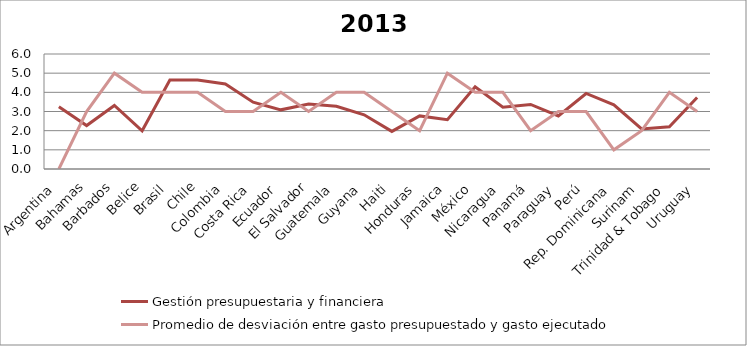
| Category | Gestión presupuestaria y financiera | Promedio de desviación entre gasto presupuestado y gasto ejecutado |
|---|---|---|
| Argentina | 3.253 | 0 |
| Bahamas | 2.267 | 3 |
| Barbados | 3.313 | 5 |
| Belice | 1.995 | 4 |
| Brasil | 4.64 | 4 |
| Chile | 4.64 | 4 |
| Colombia | 4.44 | 3 |
| Costa Rica | 3.485 | 3 |
| Ecuador | 3.087 | 4 |
| El Salvador | 3.392 | 3 |
| Guatemala | 3.275 | 4 |
| Guyana | 2.827 | 4 |
| Haiti | 1.961 | 3 |
| Honduras | 2.771 | 2 |
| Jamaica | 2.573 | 5 |
| México | 4.287 | 4 |
| Nicaragua | 3.22 | 4 |
| Panamá | 3.367 | 2 |
| Paraguay | 2.767 | 3 |
| Perú | 3.94 | 3 |
| Rep. Dominicana | 3.347 | 1 |
| Surinam | 2.093 | 2 |
| Trinidad & Tobago | 2.207 | 4 |
| Uruguay | 3.727 | 3 |